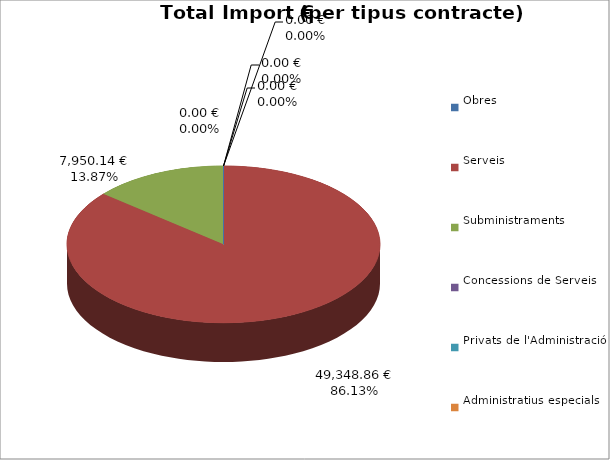
| Category | Total preu
(amb IVA) |
|---|---|
| Obres | 0 |
| Serveis | 49348.86 |
| Subministraments | 7950.14 |
| Concessions de Serveis | 0 |
| Privats de l'Administració | 0 |
| Administratius especials | 0 |